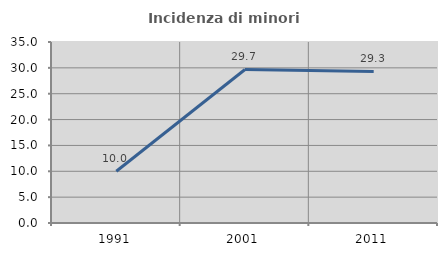
| Category | Incidenza di minori stranieri |
|---|---|
| 1991.0 | 10 |
| 2001.0 | 29.688 |
| 2011.0 | 29.31 |